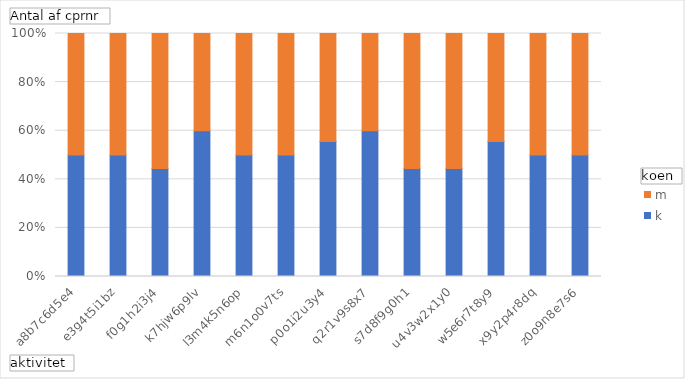
| Category | k | m |
|---|---|---|
| a8b7c6d5e4 | 5 | 5 |
| e3g4t5i1bz | 5 | 5 |
| f0g1h2i3j4 | 4 | 5 |
| k7hjw6p9lv | 6 | 4 |
| l3m4k5n6op | 5 | 5 |
| m6n1o0v7ts | 5 | 5 |
| p0o1i2u3y4 | 5 | 4 |
| q2r1v9s8x7 | 6 | 4 |
| s7d8f9g0h1 | 4 | 5 |
| u4v3w2x1y0 | 4 | 5 |
| w5e6r7t8y9 | 5 | 4 |
| x9y2p4r8dq | 5 | 5 |
| z0o9n8e7s6 | 5 | 5 |